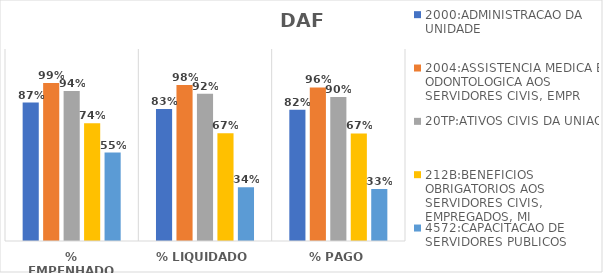
| Category | 2000:ADMINISTRACAO DA UNIDADE | 2004:ASSISTENCIA MEDICA E ODONTOLOGICA AOS SERVIDORES CIVIS, EMPR | 20TP:ATIVOS CIVIS DA UNIAO | 212B:BENEFICIOS OBRIGATORIOS AOS SERVIDORES CIVIS, EMPREGADOS, MI | 4572:CAPACITACAO DE SERVIDORES PUBLICOS FEDERAIS EM PROCESSO DE Q |
|---|---|---|---|---|---|
| % EMPENHADO | 0.866 | 0.987 | 0.938 | 0.735 | 0.552 |
| % LIQUIDADO | 0.826 | 0.975 | 0.92 | 0.673 | 0.337 |
| % PAGO | 0.82 | 0.96 | 0.9 | 0.672 | 0.325 |